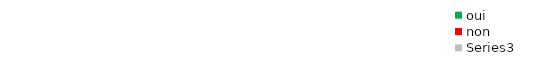
| Category | oui | non | Series 2 |
|---|---|---|---|
| 0.0 | 0 | 0 | 0 |